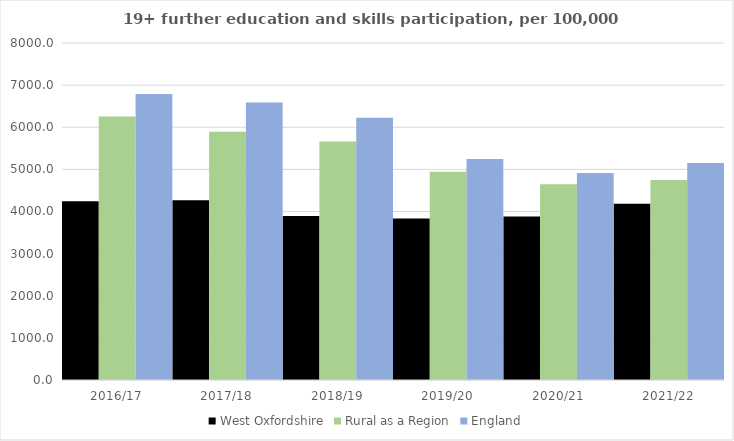
| Category | West Oxfordshire | Rural as a Region | England |
|---|---|---|---|
| 2016/17 | 4243 | 6253.401 | 6788 |
| 2017/18 | 4269 | 5892.029 | 6588 |
| 2018/19 | 3891 | 5661.873 | 6227 |
| 2019/20 | 3831 | 4943.801 | 5244 |
| 2020/21 | 3883 | 4646.727 | 4913 |
| 2021/22 | 4183 | 4747.049 | 5151 |